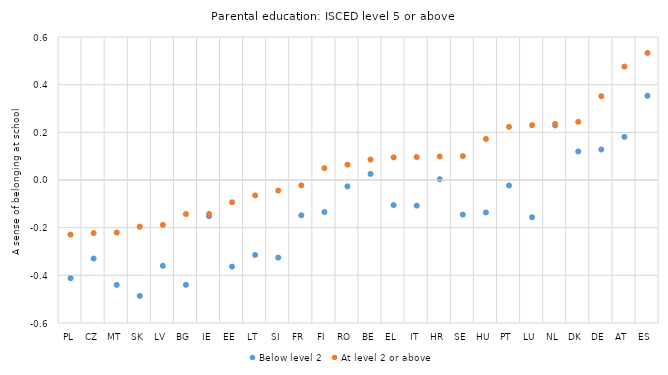
| Category | Below level 2 | At level 2 or above |
|---|---|---|
| PL | -0.412 | -0.229 |
| CZ | -0.329 | -0.223 |
| MT | -0.44 | -0.22 |
| SK | -0.487 | -0.196 |
| LV | -0.36 | -0.188 |
| BG | -0.44 | -0.143 |
| IE | -0.152 | -0.142 |
| EE | -0.363 | -0.093 |
| LT | -0.314 | -0.065 |
| SI | -0.326 | -0.044 |
| FR | -0.148 | -0.022 |
| FI | -0.135 | 0.05 |
| RO | -0.027 | 0.065 |
| BE | 0.026 | 0.086 |
| EL | -0.105 | 0.095 |
| IT | -0.107 | 0.096 |
| HR | 0.003 | 0.099 |
| SE | -0.145 | 0.1 |
| HU | -0.136 | 0.172 |
| PT | -0.023 | 0.223 |
| LU | -0.156 | 0.23 |
| NL | 0.229 | 0.235 |
| DK | 0.12 | 0.244 |
| DE | 0.128 | 0.352 |
| AT | 0.181 | 0.476 |
| ES | 0.353 | 0.533 |